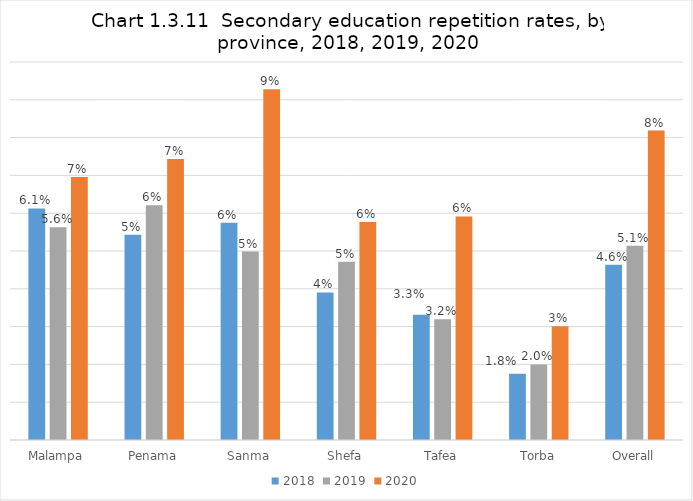
| Category | 2018 | 2019 | 2020 |
|---|---|---|---|
| Malampa | 0.061 | 0.056 | 0.07 |
| Penama | 0.054 | 0.062 | 0.074 |
| Sanma | 0.057 | 0.05 | 0.093 |
| Shefa | 0.039 | 0.047 | 0.058 |
| Tafea | 0.033 | 0.032 | 0.059 |
| Torba | 0.018 | 0.02 | 0.03 |
| Overall | 0.046 | 0.051 | 0.082 |